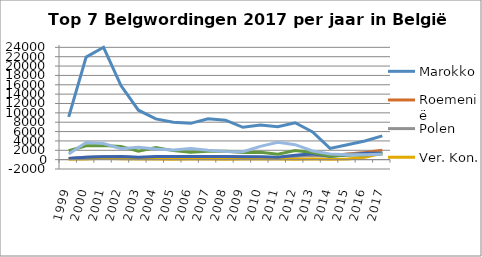
| Category | Marokko | Roemenië | Polen | Ver. Kon. | Nederland | Congo DR | Italie |
|---|---|---|---|---|---|---|---|
| 1999.0 | 9133 | 267 | 253 | 87 | 234 | 1911 | 1187 |
| 2000.0 | 21917 | 403 | 492 | 152 | 492 | 2973 | 3650 |
| 2001.0 | 24018 | 321 | 678 | 274 | 601 | 3003 | 3451 |
| 2002.0 | 15832 | 294 | 630 | 201 | 646 | 2824 | 2341 |
| 2003.0 | 10565 | 277 | 460 | 126 | 522 | 1805 | 2646 |
| 2004.0 | 8704 | 314 | 465 | 128 | 665 | 2574 | 2271 |
| 2005.0 | 7977 | 332 | 470 | 106 | 672 | 1925 | 2086 |
| 2006.0 | 7753 | 429 | 550 | 141 | 692 | 1569 | 2360 |
| 2007.0 | 8723 | 554 | 586 | 114 | 668 | 1800 | 2017 |
| 2008.0 | 8427 | 480 | 619 | 104 | 683 | 1784 | 1762 |
| 2009.0 | 6919 | 362 | 640 | 143 | 608 | 1548 | 1700 |
| 2010.0 | 7380 | 395 | 523 | 111 | 641 | 1603 | 2833 |
| 2011.0 | 7035 | 356 | 394 | 114 | 495 | 1158 | 3697 |
| 2012.0 | 7879 | 777 | 729 | 99 | 961 | 1936 | 3203 |
| 2013.0 | 5926 | 1155 | 888 | 141 | 1272 | 1526 | 1856 |
| 2014.0 | 2408 | 824 | 742 | 110 | 705 | 713 | 1199 |
| 2015.0 | 3170 | 1192 | 1136 | 127 | 993 | 1061 | 1067 |
| 2016.0 | 3996 | 1535 | 1243 | 506 | 1390 | 1016 | 1048 |
| 2017.0 | 5084 | 2031 | 1498 | 1381 | 1368 | 1201 | 1174 |